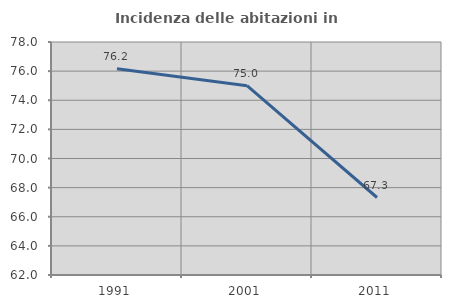
| Category | Incidenza delle abitazioni in proprietà  |
|---|---|
| 1991.0 | 76.157 |
| 2001.0 | 75 |
| 2011.0 | 67.322 |